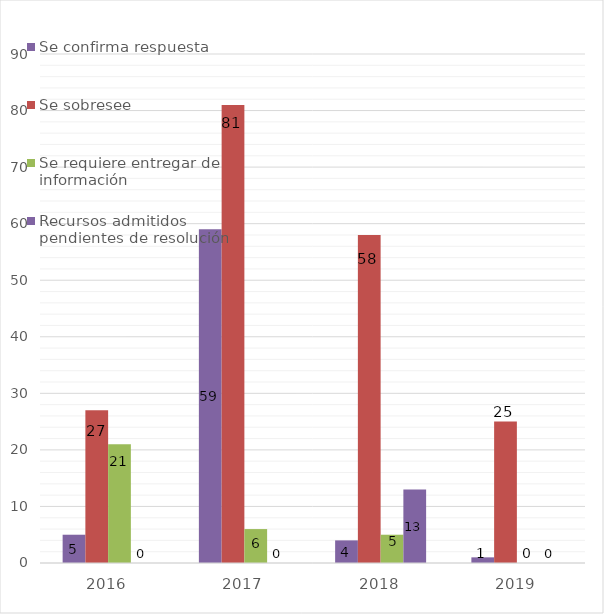
| Category | Se confirma respuesta | Se sobresee  | Se requiere entregar de información  | Recursos admitidos pendientes de resolución |
|---|---|---|---|---|
| 2016.0 | 5 | 27 | 21 | 0 |
| 2017.0 | 59 | 81 | 6 | 0 |
| 2018.0 | 4 | 58 | 5 | 13 |
| 2019.0 | 1 | 25 | 0 | 0 |